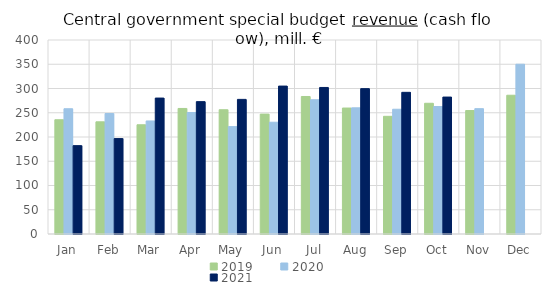
| Category | 2019 | 2020 | 2021 |
|---|---|---|---|
| Jan | 235581.606 | 258275.561 | 182213.528 |
| Feb | 231251.664 | 248374.822 | 196739.364 |
| Mar | 225206.856 | 233055.524 | 280261.929 |
| Apr | 258832.404 | 250544.497 | 272916.721 |
| May | 256203.758 | 221419.72 | 277554.305 |
| Jun | 247189.712 | 230447.876 | 304993.499 |
| Jul | 283516.218 | 276776.063 | 302140.072 |
| Aug | 259698.416 | 260132.286 | 299731.991 |
| Sep | 242624.019 | 257225.733 | 292093.132 |
| Oct | 269550.251 | 262818.474 | 282344.858 |
| Nov | 254562.176 | 258427.691 | 0 |
| Dec | 286098.933 | 350058.457 | 0 |